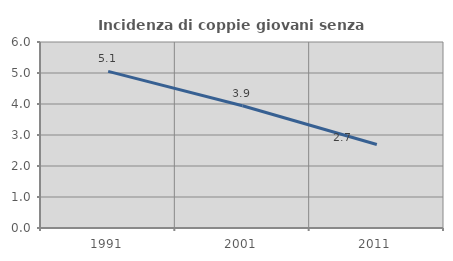
| Category | Incidenza di coppie giovani senza figli |
|---|---|
| 1991.0 | 5.052 |
| 2001.0 | 3.945 |
| 2011.0 | 2.694 |